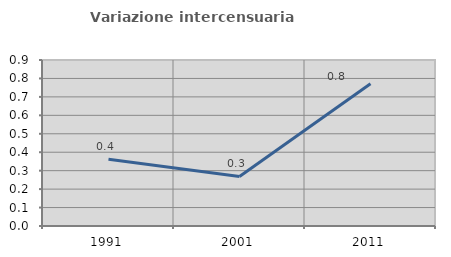
| Category | Variazione intercensuaria annua |
|---|---|
| 1991.0 | 0.361 |
| 2001.0 | 0.269 |
| 2011.0 | 0.772 |